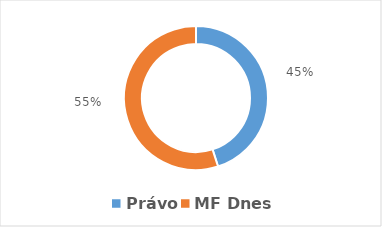
| Category | Series 0 |
|---|---|
| Právo  | 0.45 |
| MF Dnes | 0.55 |